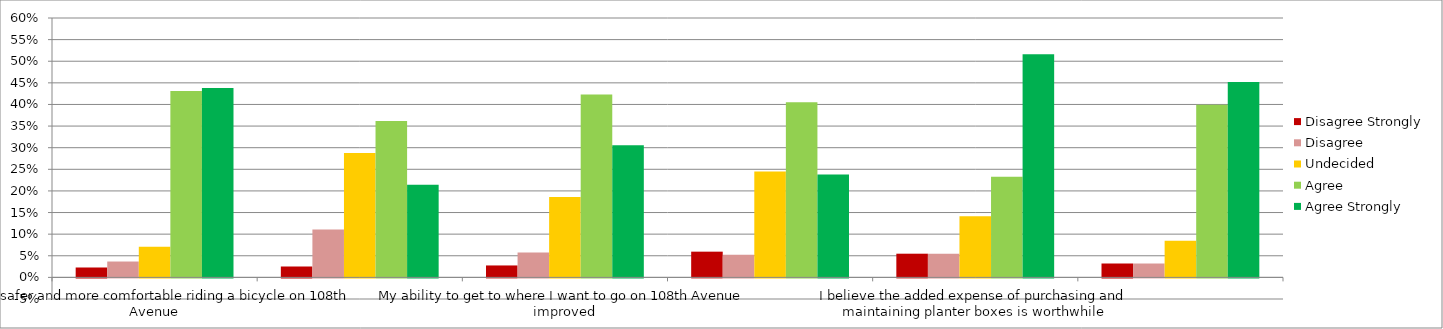
| Category | Disagree Strongly | Disagree | Undecided | Agree | Agree Strongly |
|---|---|---|---|---|---|
| It feels safer and more comfortable riding a bicycle on 108th Avenue | 0.023 | 0.037 | 0.071 | 0.431 | 0.438 |
| My travel time riding a bicycle on 108th Avenue improved | 0.025 | 0.111 | 0.288 | 0.362 | 0.214 |
| My ability to get to where I want to go on 108th Avenue improved | 0.028 | 0.058 | 0.186 | 0.423 | 0.306 |
| Driver behavior is safer and calmer with the bike lanes on 108th Avenue | 0.06 | 0.053 | 0.245 | 0.405 | 0.238 |
| I believe the added expense of purchasing and maintaining planter boxes is worthwhile | 0.055 | 0.055 | 0.142 | 0.233 | 0.516 |
| I am satisfied with the City's efforts to solicit input from the community on the 108th Avenue project | 0.032 | 0.032 | 0.085 | 0.399 | 0.452 |